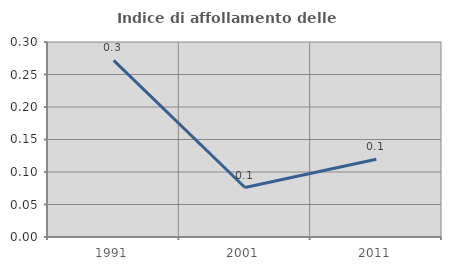
| Category | Indice di affollamento delle abitazioni  |
|---|---|
| 1991.0 | 0.272 |
| 2001.0 | 0.076 |
| 2011.0 | 0.12 |